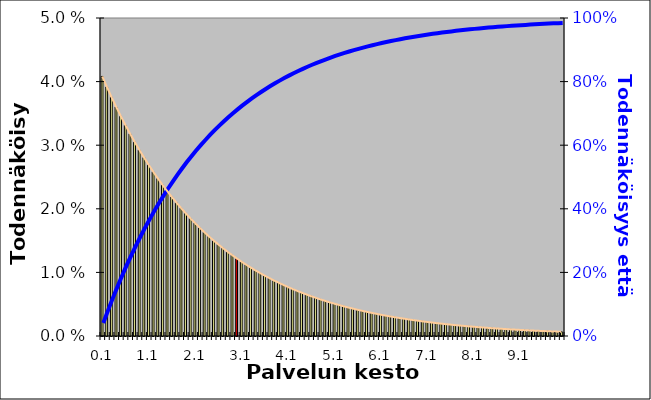
| Category | Series 1 |
|---|---|
| 0.1 | 0.041 |
| 0.2 | 0.039 |
| 0.3 | 0.038 |
| 0.4 | 0.036 |
| 0.5 | 0.035 |
| 0.6 | 0.033 |
| 0.7 | 0.032 |
| 0.8 | 0.03 |
| 0.9 | 0.029 |
| 1.0 | 0.028 |
| 1.1 | 0.027 |
| 1.2 | 0.026 |
| 1.3 | 0.025 |
| 1.4 | 0.024 |
| 1.5 | 0.023 |
| 1.6 | 0.022 |
| 1.7 | 0.021 |
| 1.8 | 0.02 |
| 1.9 | 0.019 |
| 2.0 | 0.018 |
| 2.1 | 0.018 |
| 2.2 | 0.017 |
| 2.3 | 0.016 |
| 2.4 | 0.016 |
| 2.5 | 0.015 |
| 2.6 | 0.014 |
| 2.7 | 0.014 |
| 2.8 | 0.013 |
| 2.9 | 0.013 |
| 3.0 | 0.012 |
| 3.1 | 0.012 |
| 3.2 | 0.011 |
| 3.3 | 0.011 |
| 3.4 | 0.01 |
| 3.5 | 0.01 |
| 3.6 | 0.009 |
| 3.7 | 0.009 |
| 3.8 | 0.009 |
| 3.9 | 0.008 |
| 4.0 | 0.008 |
| 4.1 | 0.008 |
| 4.2 | 0.007 |
| 4.3 | 0.007 |
| 4.4 | 0.007 |
| 4.5 | 0.007 |
| 4.6 | 0.006 |
| 4.7 | 0.006 |
| 4.8 | 0.006 |
| 4.9 | 0.006 |
| 5.0 | 0.005 |
| 5.1 | 0.005 |
| 5.2 | 0.005 |
| 5.3 | 0.005 |
| 5.4 | 0.004 |
| 5.5 | 0.004 |
| 5.6 | 0.004 |
| 5.7 | 0.004 |
| 5.8 | 0.004 |
| 5.9 | 0.004 |
| 6.0 | 0.003 |
| 6.1 | 0.003 |
| 6.2 | 0.003 |
| 6.3 | 0.003 |
| 6.4 | 0.003 |
| 6.5 | 0.003 |
| 6.6 | 0.003 |
| 6.7 | 0.003 |
| 6.8 | 0.003 |
| 6.9 | 0.002 |
| 7.0 | 0.002 |
| 7.1 | 0.002 |
| 7.2 | 0.002 |
| 7.3 | 0.002 |
| 7.4 | 0.002 |
| 7.5 | 0.002 |
| 7.6 | 0.002 |
| 7.7 | 0.002 |
| 7.8 | 0.002 |
| 7.9 | 0.002 |
| 8.0 | 0.002 |
| 8.1 | 0.001 |
| 8.2 | 0.001 |
| 8.3 | 0.001 |
| 8.4 | 0.001 |
| 8.5 | 0.001 |
| 8.6 | 0.001 |
| 8.7 | 0.001 |
| 8.8 | 0.001 |
| 8.9 | 0.001 |
| 9.0 | 0.001 |
| 9.1 | 0.001 |
| 9.2 | 0.001 |
| 9.30000000000001 | 0.001 |
| 9.4 | 0.001 |
| 9.5 | 0.001 |
| 9.60000000000001 | 0.001 |
| 9.70000000000001 | 0.001 |
| 9.80000000000001 | 0.001 |
| 9.9 | 0.001 |
| 10.0 | 0.001 |